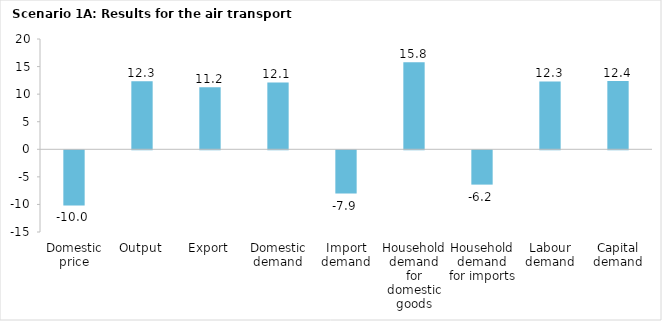
| Category | Series 0 |
|---|---|
| Domestic price | -10 |
| Output | 12.339 |
| Export | 11.228 |
| Domestic demand | 12.112 |
| Import demand | -7.854 |
| Household demand for domestic goods | 15.772 |
| Household demand for imports | -6.225 |
| Labour demand | 12.311 |
| Capital demand | 12.377 |